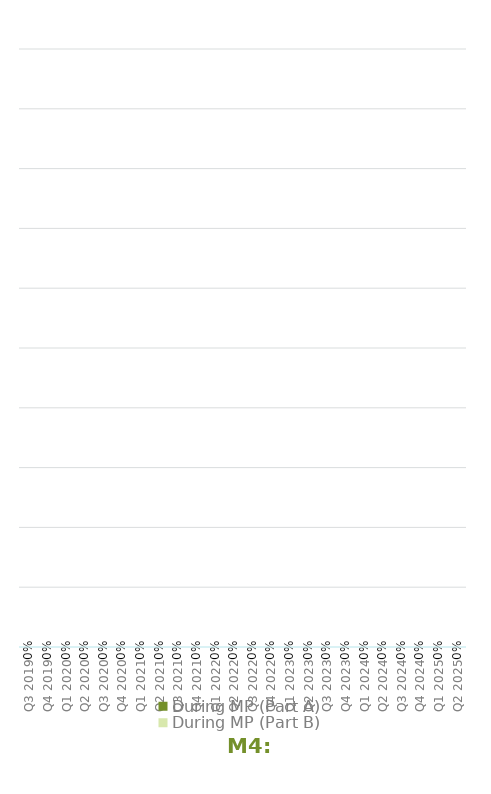
| Category | During MP (Part A) | During MP (Part B) |
|---|---|---|
| Q3 2019 | 0 | 0 |
| Q4 2019 | 0 | 0 |
| Q1 2020 | 0 | 0 |
| Q2 2020 | 0 | 0 |
| Q3 2020 | 0 | 0 |
| Q4 2020 | 0 | 0 |
| Q1 2021 | 0 | 0 |
| Q2 2021 | 0 | 0 |
| Q3 2021 | 0 | 0 |
| Q4 2021 | 0 | 0 |
| Q1 2022 | 0 | 0 |
| Q2 2022 | 0 | 0 |
| Q3 2022 | 0 | 0 |
| Q4 2022 | 0 | 0 |
| Q1 2023 | 0 | 0 |
| Q2 2023 | 0 | 0 |
| Q3 2023 | 0 | 0 |
| Q4 2023 | 0 | 0 |
| Q1 2024 | 0 | 0 |
| Q2 2024 | 0 | 0 |
| Q3 2024 | 0 | 0 |
| Q4 2024 | 0 | 0 |
| Q1 2025 | 0 | 0 |
| Q2 2025 | 0 | 0 |